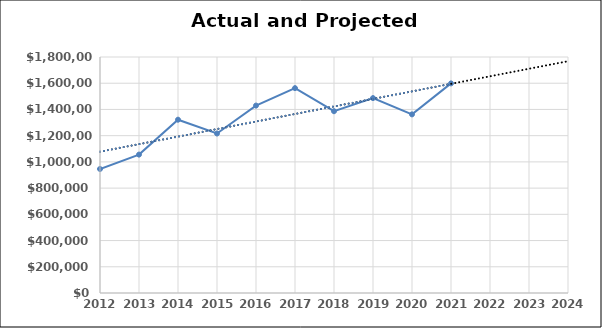
| Category | Series 0 |
|---|---|
| 2012.0 | 946000 |
| 2013.0 | 1055600 |
| 2014.0 | 1321800 |
| 2015.0 | 1216500 |
| 2016.0 | 1429500 |
| 2017.0 | 1562540 |
| 2018.0 | 1386540 |
| 2019.0 | 1486550 |
| 2020.0 | 1362500 |
| 2021.0 | 1598650 |